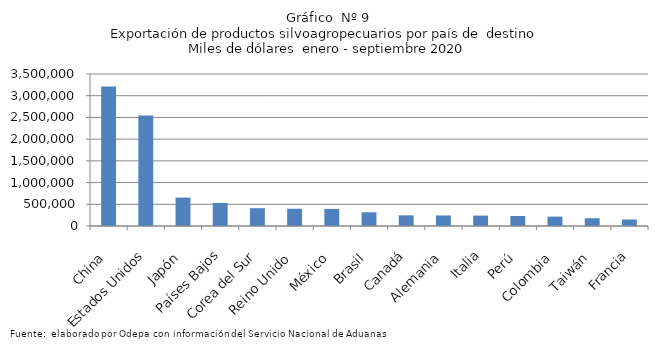
| Category | Series 0 |
|---|---|
| China | 3210914.432 |
| Estados Unidos | 2544381.309 |
| Japón | 654206.486 |
| Países Bajos | 528975.259 |
| Corea del Sur | 409906.012 |
| Reino Unido | 397547.09 |
| México | 393778.268 |
| Brasil | 315100.973 |
| Canadá | 246590.459 |
| Alemania | 243042.17 |
| Italia | 239954.347 |
| Perú | 229690.711 |
| Colombia | 215888.064 |
| Taiwán | 178221.113 |
| Francia | 149752.332 |